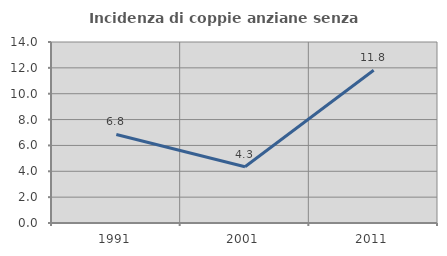
| Category | Incidenza di coppie anziane senza figli  |
|---|---|
| 1991.0 | 6.849 |
| 2001.0 | 4.348 |
| 2011.0 | 11.811 |